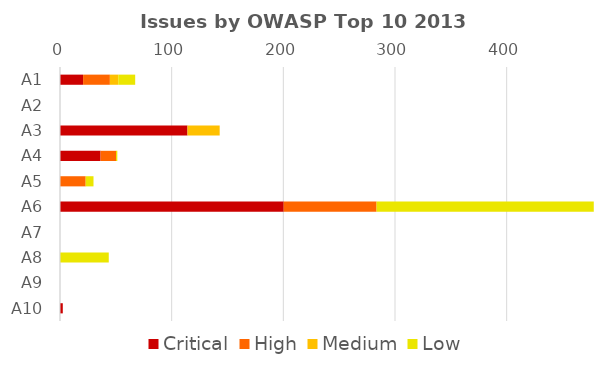
| Category | Critical | High | Medium | Low |
|---|---|---|---|---|
| A1 | 20.667 | 24 | 7.5 | 15.167 |
| A2 | 0 | 0 | 0 | 0 |
| A3 | 114.167 | 0 | 28.833 | 0 |
| A4 | 36.333 | 13.833 | 0 | 1.167 |
| A5 | 0 | 23 | 0 | 7 |
| A6 | 200.333 | 83.167 | 0 | 194.5 |
| A7 | 0 | 0 | 0 | 0 |
| A8 | 0 | 0 | 0 | 43.667 |
| A9 | 0 | 0 | 0 | 0 |
| A10 | 2.5 | 0 | 0 | 0 |